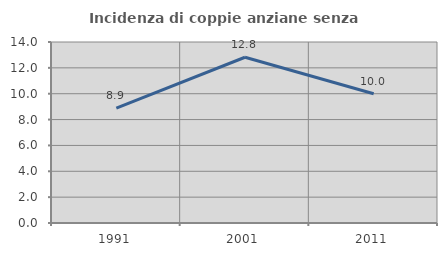
| Category | Incidenza di coppie anziane senza figli  |
|---|---|
| 1991.0 | 8.889 |
| 2001.0 | 12.821 |
| 2011.0 | 10 |